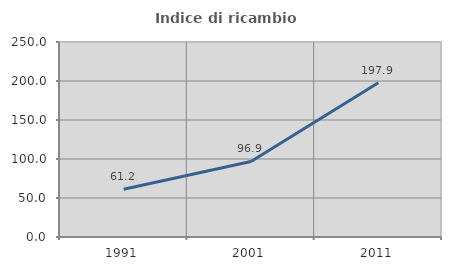
| Category | Indice di ricambio occupazionale  |
|---|---|
| 1991.0 | 61.213 |
| 2001.0 | 96.858 |
| 2011.0 | 197.872 |